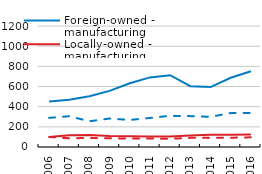
| Category | Foreign-owned - manufacturing | Locally-owned - manufacturing | Foreign-owned - services | Locally-owned - services |
|---|---|---|---|---|
| 2006.0 | 451.513 | 100 | 289.169 | 100 |
| 2007.0 | 467.858 | 116.24 | 305.365 | 86.317 |
| 2008.0 | 502.801 | 119.739 | 255.333 | 89.747 |
| 2009.0 | 556.997 | 108.257 | 282.598 | 86.254 |
| 2010.0 | 632.748 | 106.583 | 268.443 | 84.353 |
| 2011.0 | 690.352 | 104.695 | 288.377 | 83.796 |
| 2012.0 | 712.6 | 104.879 | 309.406 | 81.242 |
| 2013.0 | 603.5 | 113.803 | 306.338 | 90.713 |
| 2014.0 | 594.485 | 120.578 | 299.369 | 91.32 |
| 2015.0 | 686.919 | 120.951 | 336.742 | 92.181 |
| 2016.0 | 750.861 | 124.781 | 337.927 | 95.878 |